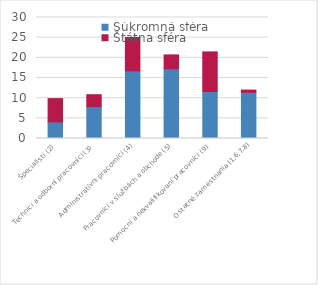
| Category | Súkromná sféra | Štátna sféra |
|---|---|---|
| Špecialisti (2) | 4.113 | 5.778 |
| Technici a odborní pracovníci (3) | 7.904 | 2.954 |
| Administratívni pracovníci (4) | 16.756 | 8.281 |
| Pracovníci v službách a obchode (5) | 17.298 | 3.432 |
| Pomocní a nekvalifikovaní pracovníci (9) | 11.658 | 9.818 |
| Ostatné zamestnania (1,6,7,8) | 11.456 | 0.552 |